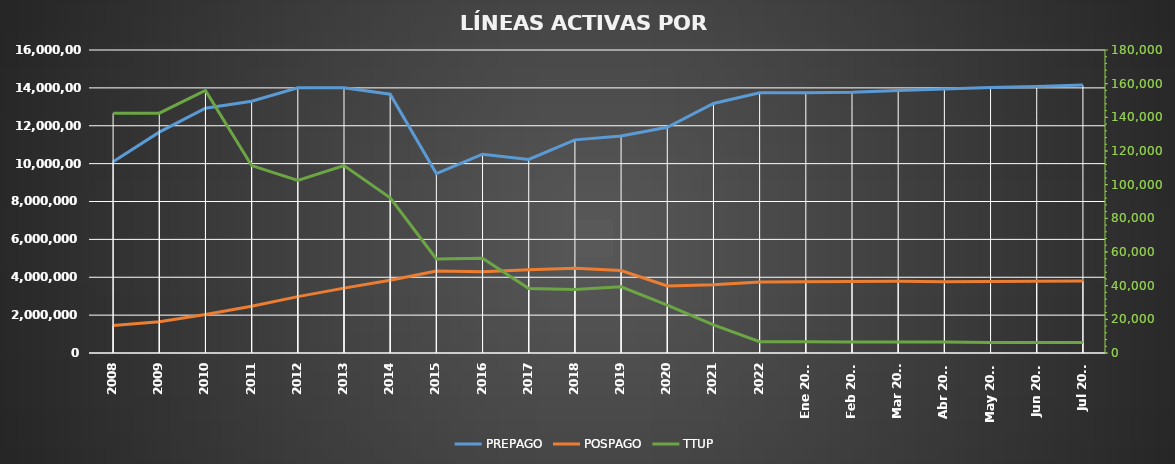
| Category | PREPAGO | POSPAGO |
|---|---|---|
| 2008 | 10097768 | 1452088 |
| 2009 | 11662294 | 1649838 |
| 2010 | 12929040 | 2033814 |
| 2011 | 13295834 | 2467378 |
| 2012 | 14008104 | 2976194 |
| 2013 | 14005126 | 3425277 |
| 2014 | 13666071 | 3846271 |
| 2015 | 9476240 | 4326937 |
| 2016 | 10498467 | 4293426 |
| 2017 | 10219457 | 4393703 |
| 2018 | 11254168 | 4480975 |
| 2019 | 11462048 | 4351686 |
| 2020 | 11917697 | 3539192 |
| 2021 | 13174530 | 3598383 |
| 2022 | 13740159 | 3743849 |
| Ene 2023 | 13744592 | 3762200 |
| Feb 2023 | 13771967 | 3773530 |
| Mar 2023 | 13859395 | 3786936 |
| Abr 2023 | 13944065 | 3768457 |
| May 2023 | 14014722 | 3780848 |
| Jun 2023 | 14075353 | 3791176 |
| Jul 2023 | 14147912 | 3799557 |